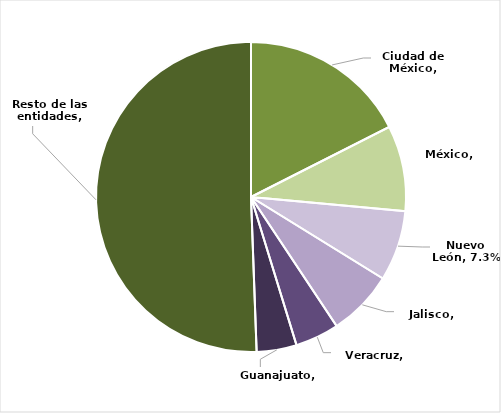
| Category | Series 0 |
|---|---|
| Ciudad de México | 0.175 |
| México | 0.089 |
| Nuevo León | 0.073 |
| Jalisco | 0.069 |
| Veracruz | 0.046 |
| Guanajuato | 0.042 |
| Resto de las entidades | 0.506 |